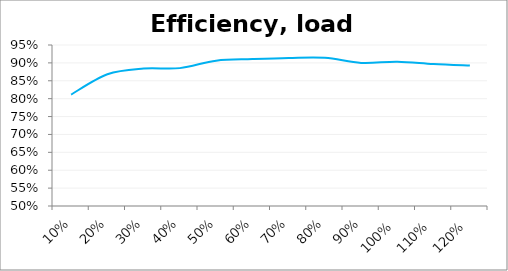
| Category | Efficiency test, load |
|---|---|
| 0.1 | 0.812 |
| 0.2 | 0.868 |
| 0.3 | 0.884 |
| 0.4 | 0.885 |
| 0.5 | 0.906 |
| 0.6 | 0.911 |
| 0.7 | 0.914 |
| 0.8 | 0.914 |
| 0.9 | 0.9 |
| 1.0 | 0.903 |
| 1.1 | 0.897 |
| 1.2 | 0.892 |